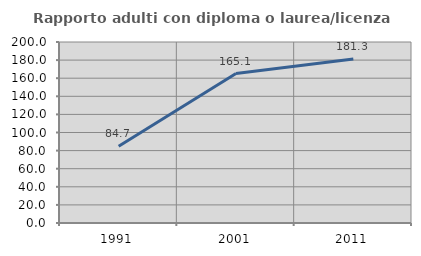
| Category | Rapporto adulti con diploma o laurea/licenza media  |
|---|---|
| 1991.0 | 84.722 |
| 2001.0 | 165.116 |
| 2011.0 | 181.25 |